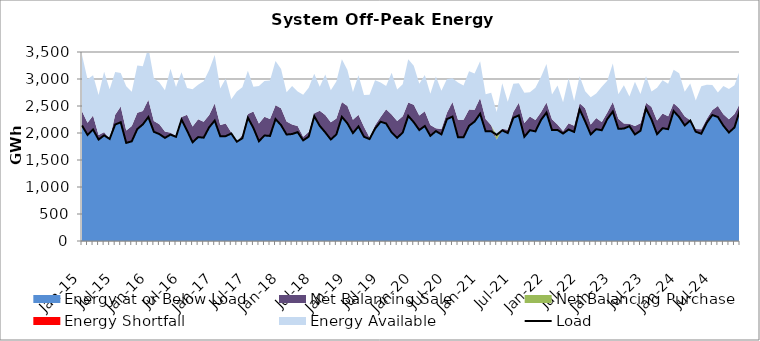
| Category | Load |
|---|---|
| 2015-01-01 | 2139.018 |
| 2015-02-01 | 1965.306 |
| 2015-03-01 | 2063.859 |
| 2015-04-01 | 1878.645 |
| 2015-05-01 | 1956.315 |
| 2015-06-01 | 1890.804 |
| 2015-07-01 | 2157.274 |
| 2015-08-01 | 2198.869 |
| 2015-09-01 | 1816.521 |
| 2015-10-01 | 1846.349 |
| 2015-11-01 | 2073.286 |
| 2015-12-01 | 2159.025 |
| 2016-01-01 | 2295.491 |
| 2016-02-01 | 2021.989 |
| 2016-03-01 | 1979.422 |
| 2016-04-01 | 1910.316 |
| 2016-05-01 | 1969.534 |
| 2016-06-01 | 1929.7 |
| 2016-07-01 | 2249.967 |
| 2016-08-01 | 2044.931 |
| 2016-09-01 | 1828.248 |
| 2016-10-01 | 1924.055 |
| 2016-11-01 | 1913.486 |
| 2016-12-01 | 2106.132 |
| 2017-01-01 | 2230.007 |
| 2017-02-01 | 1940.458 |
| 2017-03-01 | 1942.078 |
| 2017-04-01 | 1990.727 |
| 2017-05-01 | 1838.95 |
| 2017-06-01 | 1902.78 |
| 2017-07-01 | 2283.291 |
| 2017-08-01 | 2093.352 |
| 2017-09-01 | 1847.43 |
| 2017-10-01 | 1954.184 |
| 2017-11-01 | 1945.461 |
| 2017-12-01 | 2258.195 |
| 2018-01-01 | 2145.11 |
| 2018-02-01 | 1971.398 |
| 2018-03-01 | 1981.277 |
| 2018-04-01 | 2015.379 |
| 2018-05-01 | 1863.303 |
| 2018-06-01 | 1933.221 |
| 2018-07-01 | 2310.584 |
| 2018-08-01 | 2132.055 |
| 2018-09-01 | 2010.951 |
| 2018-10-01 | 1879.686 |
| 2018-11-01 | 1972.792 |
| 2018-12-01 | 2299.28 |
| 2019-01-01 | 2178.458 |
| 2019-02-01 | 1999.241 |
| 2019-03-01 | 2121.274 |
| 2019-04-01 | 1930.226 |
| 2019-05-01 | 1887.261 |
| 2019-06-01 | 2080.984 |
| 2019-07-01 | 2208.578 |
| 2019-08-01 | 2175.988 |
| 2019-09-01 | 2009.62 |
| 2019-10-01 | 1911.198 |
| 2019-11-01 | 2007.248 |
| 2019-12-01 | 2317.017 |
| 2020-01-01 | 2200.057 |
| 2020-02-01 | 2054.959 |
| 2020-03-01 | 2129.385 |
| 2020-04-01 | 1947.619 |
| 2020-05-01 | 2035.359 |
| 2020-06-01 | 1974.65 |
| 2020-07-01 | 2257.438 |
| 2020-08-01 | 2303.265 |
| 2020-09-01 | 1922.27 |
| 2020-10-01 | 1921.384 |
| 2020-11-01 | 2133.17 |
| 2020-12-01 | 2212.022 |
| 2021-01-01 | 2357.779 |
| 2021-02-01 | 2030.483 |
| 2021-03-01 | 2031.691 |
| 2021-04-01 | 1966.461 |
| 2021-05-01 | 2048.134 |
| 2021-06-01 | 1999.994 |
| 2021-07-01 | 2280.723 |
| 2021-08-01 | 2326.292 |
| 2021-09-01 | 1929.964 |
| 2021-10-01 | 2052.141 |
| 2021-11-01 | 2030.227 |
| 2021-12-01 | 2240.35 |
| 2022-01-01 | 2376.936 |
| 2022-02-01 | 2053.629 |
| 2022-03-01 | 2056.173 |
| 2022-04-01 | 1990.057 |
| 2022-05-01 | 2064.656 |
| 2022-06-01 | 2020.044 |
| 2022-07-01 | 2437.44 |
| 2022-08-01 | 2214.951 |
| 2022-09-01 | 1974.159 |
| 2022-10-01 | 2070.775 |
| 2022-11-01 | 2050.778 |
| 2022-12-01 | 2258.72 |
| 2023-01-01 | 2397.638 |
| 2023-02-01 | 2077.176 |
| 2023-03-01 | 2082.426 |
| 2023-04-01 | 2126.105 |
| 2023-05-01 | 1973.3 |
| 2023-06-01 | 2041.78 |
| 2023-07-01 | 2454.719 |
| 2023-08-01 | 2249.062 |
| 2023-09-01 | 1978.417 |
| 2023-10-01 | 2088.807 |
| 2023-11-01 | 2071.088 |
| 2023-12-01 | 2406.572 |
| 2024-01-01 | 2295.371 |
| 2024-02-01 | 2140.137 |
| 2024-03-01 | 2231.427 |
| 2024-04-01 | 2024.084 |
| 2024-05-01 | 1986.535 |
| 2024-06-01 | 2191.578 |
| 2024-07-01 | 2333.423 |
| 2024-08-01 | 2296.116 |
| 2024-09-01 | 2135.124 |
| 2024-10-01 | 2009.298 |
| 2024-11-01 | 2102.984 |
| 2024-12-01 | 2430.765 |